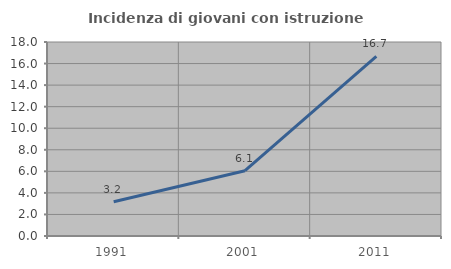
| Category | Incidenza di giovani con istruzione universitaria |
|---|---|
| 1991.0 | 3.175 |
| 2001.0 | 6.061 |
| 2011.0 | 16.667 |